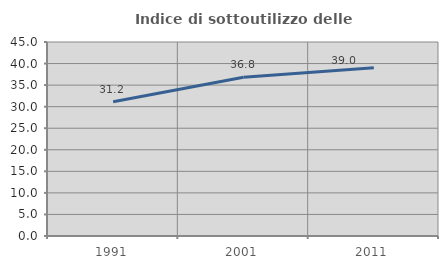
| Category | Indice di sottoutilizzo delle abitazioni  |
|---|---|
| 1991.0 | 31.159 |
| 2001.0 | 36.805 |
| 2011.0 | 39.021 |